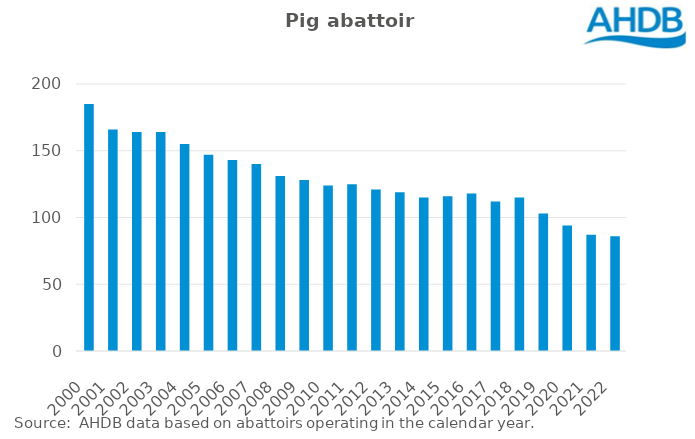
| Category | Pig abattoir numbers  |
|---|---|
| 2000-01-01 | 185 |
| 2001-01-01 | 166 |
| 2002-01-01 | 164 |
| 2003-01-01 | 164 |
| 2004-01-01 | 155 |
| 2005-01-01 | 147 |
| 2006-01-01 | 143 |
| 2007-01-01 | 140 |
| 2008-01-01 | 131 |
| 2009-01-01 | 128 |
| 2010-01-01 | 124 |
| 2011-01-01 | 125 |
| 2012-01-01 | 121 |
| 2013-01-01 | 119 |
| 2014-01-01 | 115 |
| 2015-01-01 | 116 |
| 2016-01-01 | 118 |
| 2017-01-01 | 112 |
| 2018-01-01 | 115 |
| 2019-01-01 | 103 |
| 2020-01-01 | 94 |
| 2021-01-01 | 87 |
| 2022-01-01 | 86 |